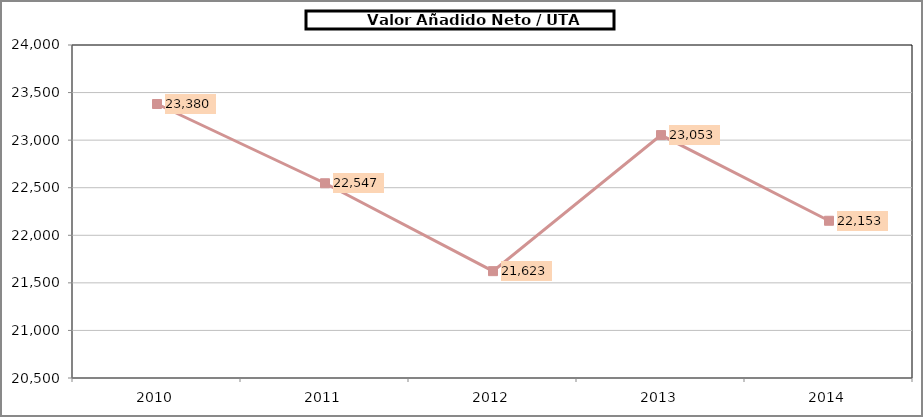
| Category |      Valor Añadido Neto / UTA (euros/UTA) |
|---|---|
| 2010.0 | 23379.786 |
| 2011.0 | 22546.842 |
| 2012.0 | 21623.058 |
| 2013.0 | 23053.311 |
| 2014.0 | 22152.759 |